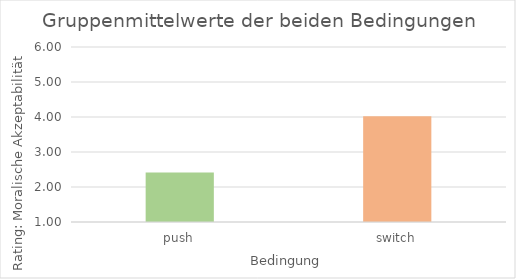
| Category | Mittelwert |
|---|---|
| push | 2.413 |
| switch | 4.022 |